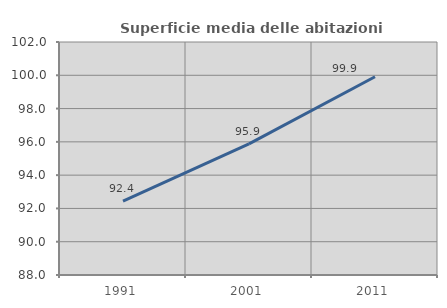
| Category | Superficie media delle abitazioni occupate |
|---|---|
| 1991.0 | 92.442 |
| 2001.0 | 95.875 |
| 2011.0 | 99.91 |